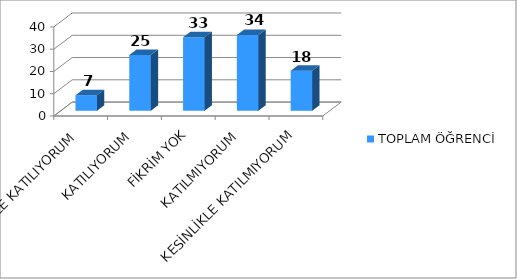
| Category | TOPLAM ÖĞRENCİ |
|---|---|
| KESİNLİKLE KATILIYORUM | 7 |
| KATILIYORUM | 25 |
| FİKRİM YOK | 33 |
| KATILMIYORUM | 34 |
| KESİNLİKLE KATILMIYORUM | 18 |